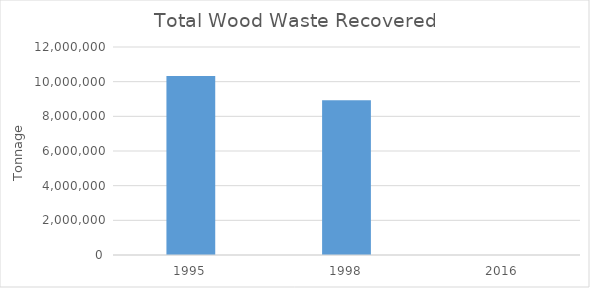
| Category | Total Wood Waste Recovered |
|---|---|
| 1995.0 | 10320000 |
| 1998.0 | 8932000 |
| 2016.0 | 0 |